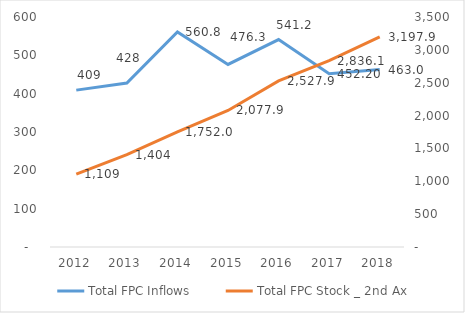
| Category | Total FPC Inflows |
|---|---|
| 2012.0 | 409.271 |
| 2013.0 | 427.718 |
| 2014.0 | 560.807 |
| 2015.0 | 476.252 |
| 2016.0 | 541.158 |
| 2017.0 | 452.196 |
| 2018.0 | 463.007 |